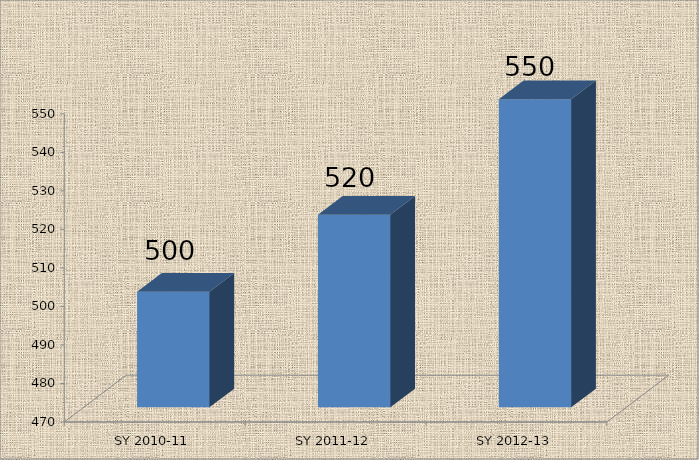
| Category | Series 0 |
|---|---|
| SY 2010-11 | 500 |
| SY 2011-12 | 520 |
| SY 2012-13 | 550 |